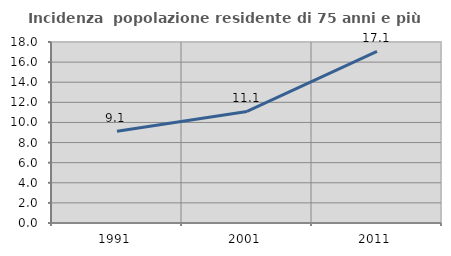
| Category | Incidenza  popolazione residente di 75 anni e più |
|---|---|
| 1991.0 | 9.128 |
| 2001.0 | 11.094 |
| 2011.0 | 17.069 |